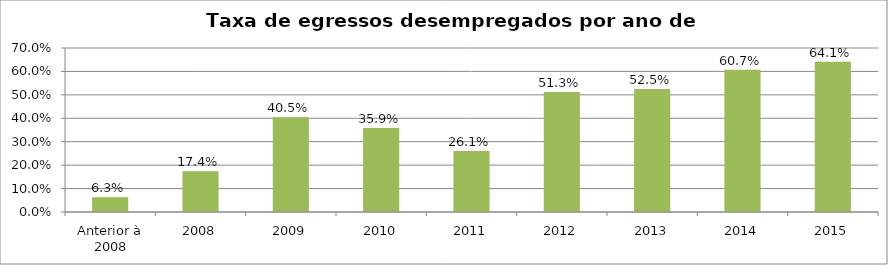
| Category | % egressos desempregados* |
|---|---|
| Anterior à 2008 | 0.063 |
| 2008 | 0.174 |
| 2009 | 0.405 |
| 2010 | 0.359 |
| 2011 | 0.261 |
| 2012 | 0.513 |
| 2013 | 0.525 |
| 2014 | 0.607 |
| 2015 | 0.641 |